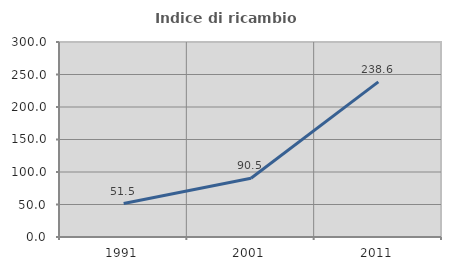
| Category | Indice di ricambio occupazionale  |
|---|---|
| 1991.0 | 51.456 |
| 2001.0 | 90.479 |
| 2011.0 | 238.64 |